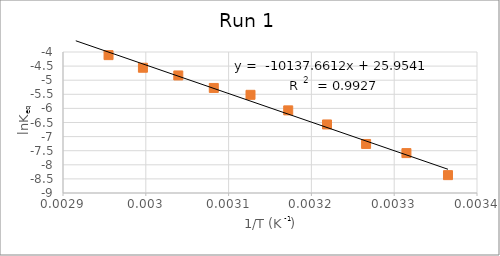
| Category | Series 1 |
|---|---|
| 0.003364963994885255 | -8.367 |
| 0.003314770617873243 | -7.585 |
| 0.0032660526487686982 | -7.261 |
| 0.0032188495831589788 | -6.569 |
| 0.003171985028230667 | -6.07 |
| 0.0031264655307175235 | -5.518 |
| 0.0030821390044691015 | -5.275 |
| 0.0030392365437802026 | -4.832 |
| 0.002996524032122737 | -4.558 |
| 0.002954995419757099 | -4.111 |
| 0.0029154518950437317 | -3.615 |